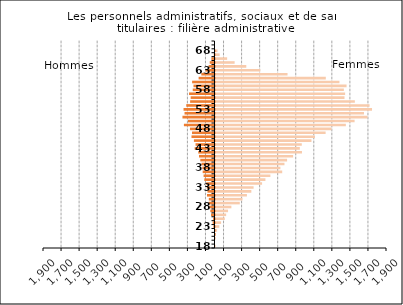
| Category | Series 2 |
|---|---|
| 18.0 | 2 |
| 19.0 | 0 |
| 20.0 | 4 |
| 21.0 | 5 |
| 22.0 | 18 |
| 23.0 | 42 |
| 24.0 | 62 |
| 25.0 | 103 |
| 26.0 | 118 |
| 27.0 | 139 |
| 28.0 | 176 |
| 29.0 | 269 |
| 30.0 | 299 |
| 31.0 | 348 |
| 32.0 | 397 |
| 33.0 | 422 |
| 34.0 | 516 |
| 35.0 | 553 |
| 36.0 | 608 |
| 37.0 | 739 |
| 38.0 | 719 |
| 39.0 | 764 |
| 40.0 | 793 |
| 41.0 | 860 |
| 42.0 | 958 |
| 43.0 | 934 |
| 44.0 | 956 |
| 45.0 | 1063 |
| 46.0 | 1102 |
| 47.0 | 1220 |
| 48.0 | 1286 |
| 49.0 | 1444 |
| 50.0 | 1541 |
| 51.0 | 1684 |
| 52.0 | 1645 |
| 53.0 | 1734 |
| 54.0 | 1707 |
| 55.0 | 1544 |
| 56.0 | 1429 |
| 57.0 | 1436 |
| 58.0 | 1422 |
| 59.0 | 1452 |
| 60.0 | 1373 |
| 61.0 | 1222 |
| 62.0 | 798 |
| 63.0 | 496 |
| 64.0 | 341 |
| 65.0 | 212 |
| 66.0 | 129 |
| 67.0 | 46 |
| 68.0 | 22 |
| 69.0 | 0 |
| 70.0 | 0 |